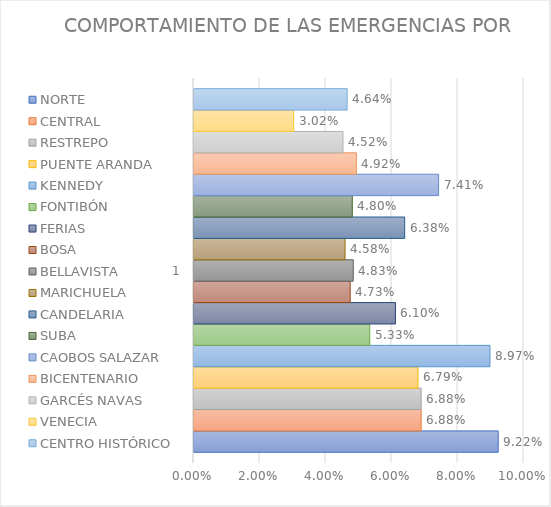
| Category | NORTE | CENTRAL | RESTREPO | PUENTE ARANDA | KENNEDY | FONTIBÓN | FERIAS | BOSA | BELLAVISTA | MARICHUELA | CANDELARIA | SUBA | CAOBOS SALAZAR | BICENTENARIO | GARCÉS NAVAS | VENECIA | CENTRO HISTÓRICO |
|---|---|---|---|---|---|---|---|---|---|---|---|---|---|---|---|---|---|
| 0 | 0.092 | 0.069 | 0.069 | 0.068 | 0.09 | 0.053 | 0.061 | 0.047 | 0.048 | 0.046 | 0.064 | 0.048 | 0.074 | 0.049 | 0.045 | 0.03 | 0.046 |